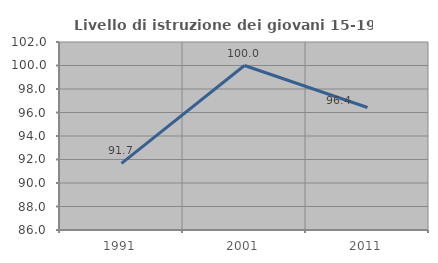
| Category | Livello di istruzione dei giovani 15-19 anni |
|---|---|
| 1991.0 | 91.667 |
| 2001.0 | 100 |
| 2011.0 | 96.429 |